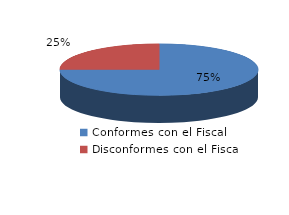
| Category | Series 0 |
|---|---|
| 0 | 120 |
| 1 | 40 |